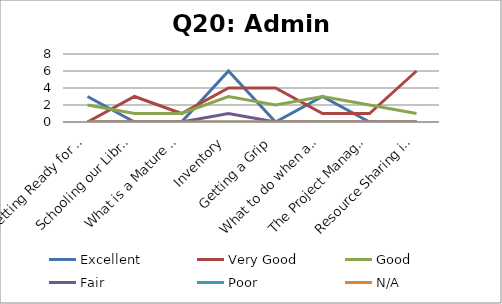
| Category | Excellent | Very Good | Good | Fair | Poor | N/A |
|---|---|---|---|---|---|---|
| Getting Ready for Migration | 3 | 0 | 2 | 0 | 0 | 0 |
| Schooling our Libraries | 0 | 3 | 1 | 0 | 0 | 0 |
| What is a Mature Consortium to do? | 0 | 1 | 1 | 0 | 0 | 0 |
| Inventory | 6 | 4 | 3 | 1 | 0 | 0 |
| Getting a Grip  | 0 | 4 | 2 | 0 | 0 | 0 |
| What to do when a Green Tree Scares  | 3 | 1 | 3 | 0 | 0 | 0 |
| The Project Managers Speak | 0 | 1 | 2 | 0 | 0 | 0 |
| Resource Sharing in EG | 0 | 6 | 1 | 0 | 0 | 0 |